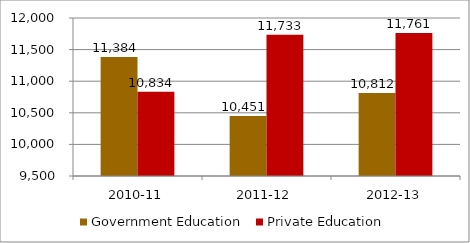
| Category | Government Education | Private Education |
|---|---|---|
| 2010-11 | 11384 | 10834 |
| 2011-12 | 10451 | 11733 |
| 2012-13 | 10812 | 11761 |